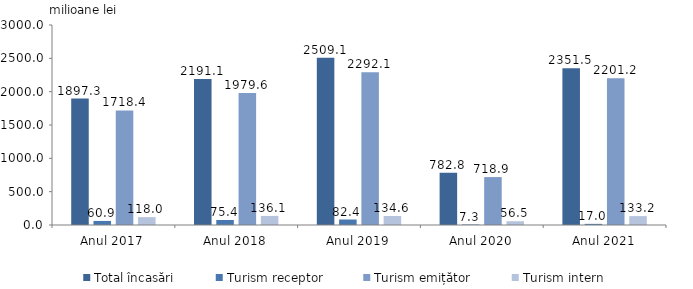
| Category | Total încasări | Turism receptor | Turism emițător | Turism intern |
|---|---|---|---|---|
| Anul 2017 | 1897.3 | 60.9 | 1718.4 | 118 |
| Anul 2018 | 2191.1 | 75.4 | 1979.6 | 136.1 |
| Anul 2019 | 2509.1 | 82.4 | 2292.1 | 134.6 |
| Anul 2020 | 782.8 | 7.32 | 718.93 | 56.52 |
| Anul 2021 | 2351.45 | 17.02 | 2201.22 | 133.22 |